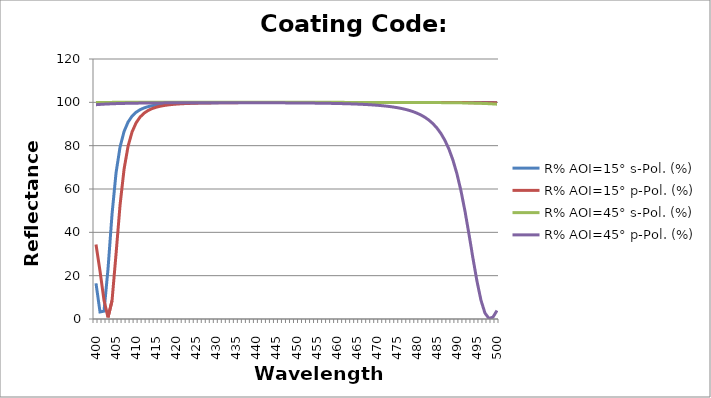
| Category | R% AOI=15° s-Pol. (%) | R% AOI=15° p-Pol. (%) | R% AOI=45° s-Pol. (%) | R% AOI=45° p-Pol. (%) |
|---|---|---|---|---|
| 400.0 | 16.468 | 34.349 | 99.974 | 98.908 |
| 401.0 | 3.252 | 22.122 | 99.976 | 99.046 |
| 402.0 | 3.618 | 8.572 | 99.978 | 99.16 |
| 403.0 | 23.224 | 0.733 | 99.979 | 99.255 |
| 404.0 | 48.434 | 8.478 | 99.98 | 99.335 |
| 405.0 | 67.486 | 30.067 | 99.982 | 99.403 |
| 406.0 | 79.407 | 52.662 | 99.983 | 99.46 |
| 407.0 | 86.56 | 69.19 | 99.984 | 99.509 |
| 408.0 | 90.912 | 79.784 | 99.985 | 99.551 |
| 409.0 | 93.643 | 86.382 | 99.986 | 99.587 |
| 410.0 | 95.417 | 90.541 | 99.986 | 99.618 |
| 411.0 | 96.608 | 93.233 | 99.987 | 99.645 |
| 412.0 | 97.43 | 95.028 | 99.987 | 99.669 |
| 413.0 | 98.012 | 96.254 | 99.988 | 99.69 |
| 414.0 | 98.434 | 97.119 | 99.988 | 99.708 |
| 415.0 | 98.748 | 97.743 | 99.989 | 99.724 |
| 416.0 | 98.984 | 98.203 | 99.989 | 99.738 |
| 417.0 | 99.165 | 98.548 | 99.99 | 99.75 |
| 418.0 | 99.306 | 98.811 | 99.99 | 99.761 |
| 419.0 | 99.417 | 99.014 | 99.99 | 99.771 |
| 420.0 | 99.506 | 99.174 | 99.99 | 99.779 |
| 421.0 | 99.577 | 99.301 | 99.99 | 99.787 |
| 422.0 | 99.635 | 99.403 | 99.991 | 99.793 |
| 423.0 | 99.683 | 99.486 | 99.991 | 99.799 |
| 424.0 | 99.722 | 99.554 | 99.991 | 99.804 |
| 425.0 | 99.755 | 99.61 | 99.991 | 99.808 |
| 426.0 | 99.783 | 99.656 | 99.991 | 99.811 |
| 427.0 | 99.806 | 99.695 | 99.991 | 99.814 |
| 428.0 | 99.826 | 99.728 | 99.991 | 99.816 |
| 429.0 | 99.843 | 99.756 | 99.991 | 99.818 |
| 430.0 | 99.858 | 99.78 | 99.992 | 99.819 |
| 431.0 | 99.87 | 99.801 | 99.992 | 99.82 |
| 432.0 | 99.881 | 99.819 | 99.992 | 99.82 |
| 433.0 | 99.891 | 99.834 | 99.992 | 99.82 |
| 434.0 | 99.899 | 99.847 | 99.992 | 99.819 |
| 435.0 | 99.906 | 99.859 | 99.991 | 99.818 |
| 436.0 | 99.913 | 99.869 | 99.991 | 99.816 |
| 437.0 | 99.918 | 99.878 | 99.991 | 99.813 |
| 438.0 | 99.924 | 99.886 | 99.991 | 99.81 |
| 439.0 | 99.928 | 99.893 | 99.991 | 99.806 |
| 440.0 | 99.932 | 99.899 | 99.991 | 99.802 |
| 441.0 | 99.936 | 99.905 | 99.991 | 99.797 |
| 442.0 | 99.939 | 99.91 | 99.99 | 99.792 |
| 443.0 | 99.942 | 99.914 | 99.99 | 99.785 |
| 444.0 | 99.944 | 99.918 | 99.99 | 99.778 |
| 445.0 | 99.946 | 99.921 | 99.99 | 99.77 |
| 446.0 | 99.948 | 99.925 | 99.99 | 99.762 |
| 447.0 | 99.95 | 99.927 | 99.989 | 99.752 |
| 448.0 | 99.952 | 99.93 | 99.989 | 99.741 |
| 449.0 | 99.953 | 99.932 | 99.989 | 99.729 |
| 450.0 | 99.954 | 99.934 | 99.988 | 99.716 |
| 451.0 | 99.956 | 99.936 | 99.988 | 99.701 |
| 452.0 | 99.956 | 99.937 | 99.987 | 99.685 |
| 453.0 | 99.957 | 99.938 | 99.987 | 99.666 |
| 454.0 | 99.958 | 99.94 | 99.986 | 99.646 |
| 455.0 | 99.959 | 99.941 | 99.986 | 99.624 |
| 456.0 | 99.959 | 99.942 | 99.985 | 99.599 |
| 457.0 | 99.96 | 99.942 | 99.984 | 99.572 |
| 458.0 | 99.96 | 99.943 | 99.984 | 99.541 |
| 459.0 | 99.96 | 99.943 | 99.983 | 99.507 |
| 460.0 | 99.961 | 99.944 | 99.982 | 99.468 |
| 461.0 | 99.961 | 99.944 | 99.981 | 99.425 |
| 462.0 | 99.961 | 99.944 | 99.98 | 99.376 |
| 463.0 | 99.961 | 99.944 | 99.979 | 99.322 |
| 464.0 | 99.96 | 99.944 | 99.978 | 99.261 |
| 465.0 | 99.96 | 99.943 | 99.976 | 99.191 |
| 466.0 | 99.96 | 99.943 | 99.975 | 99.112 |
| 467.0 | 99.96 | 99.942 | 99.973 | 99.023 |
| 468.0 | 99.959 | 99.942 | 99.971 | 98.92 |
| 469.0 | 99.959 | 99.941 | 99.969 | 98.803 |
| 470.0 | 99.958 | 99.94 | 99.967 | 98.667 |
| 471.0 | 99.958 | 99.939 | 99.965 | 98.51 |
| 472.0 | 99.957 | 99.938 | 99.962 | 98.329 |
| 473.0 | 99.956 | 99.937 | 99.959 | 98.117 |
| 474.0 | 99.955 | 99.936 | 99.956 | 97.87 |
| 475.0 | 99.954 | 99.934 | 99.952 | 97.578 |
| 476.0 | 99.953 | 99.932 | 99.948 | 97.234 |
| 477.0 | 99.952 | 99.93 | 99.944 | 96.825 |
| 478.0 | 99.95 | 99.928 | 99.939 | 96.336 |
| 479.0 | 99.949 | 99.926 | 99.933 | 95.75 |
| 480.0 | 99.947 | 99.924 | 99.927 | 95.04 |
| 481.0 | 99.945 | 99.921 | 99.92 | 94.177 |
| 482.0 | 99.943 | 99.918 | 99.912 | 93.121 |
| 483.0 | 99.941 | 99.915 | 99.902 | 91.819 |
| 484.0 | 99.939 | 99.912 | 99.892 | 90.205 |
| 485.0 | 99.936 | 99.908 | 99.88 | 88.192 |
| 486.0 | 99.934 | 99.904 | 99.866 | 85.666 |
| 487.0 | 99.93 | 99.899 | 99.851 | 82.485 |
| 488.0 | 99.927 | 99.894 | 99.833 | 78.47 |
| 489.0 | 99.924 | 99.889 | 99.812 | 73.412 |
| 490.0 | 99.92 | 99.883 | 99.788 | 67.083 |
| 491.0 | 99.916 | 99.877 | 99.76 | 59.287 |
| 492.0 | 99.911 | 99.87 | 99.727 | 49.951 |
| 493.0 | 99.906 | 99.862 | 99.689 | 39.276 |
| 494.0 | 99.901 | 99.854 | 99.645 | 28.089 |
| 495.0 | 99.895 | 99.845 | 99.594 | 17.516 |
| 496.0 | 99.889 | 99.836 | 99.533 | 8.677 |
| 497.0 | 99.882 | 99.825 | 99.461 | 2.736 |
| 498.0 | 99.875 | 99.814 | 99.376 | 0.226 |
| 499.0 | 99.867 | 99.801 | 99.272 | 0.888 |
| 500.0 | 99.858 | 99.787 | 99.147 | 3.911 |